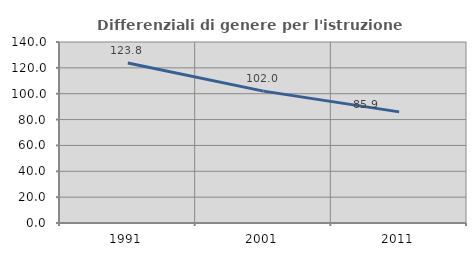
| Category | Differenziali di genere per l'istruzione superiore |
|---|---|
| 1991.0 | 123.765 |
| 2001.0 | 102.012 |
| 2011.0 | 85.946 |